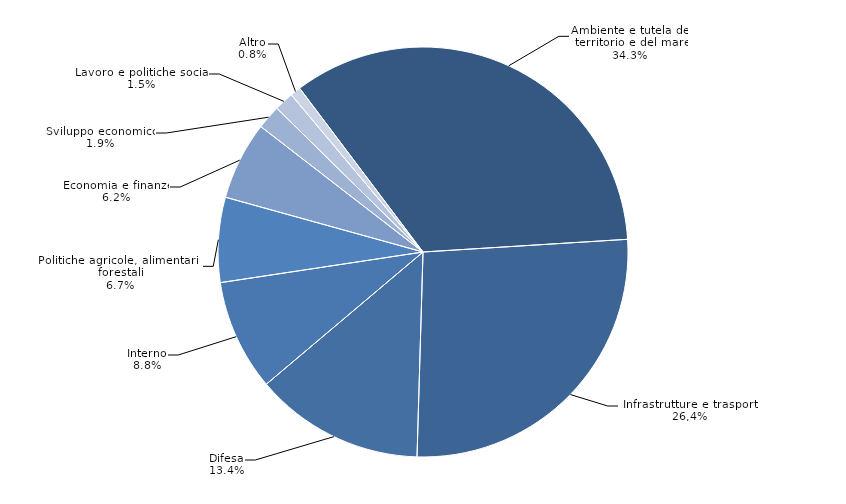
| Category | Series 0 |
|---|---|
| Ambiente e tutela del territorio e del mare | 0.343 |
| Infrastrutture e trasporti | 0.265 |
| Difesa | 0.134 |
| Interno | 0.088 |
| Politiche agricole, alimentari e forestali | 0.067 |
| Economia e finanze | 0.062 |
| Sviluppo economico | 0.019 |
| Lavoro e politiche sociali | 0.015 |
| Altro | 0.008 |